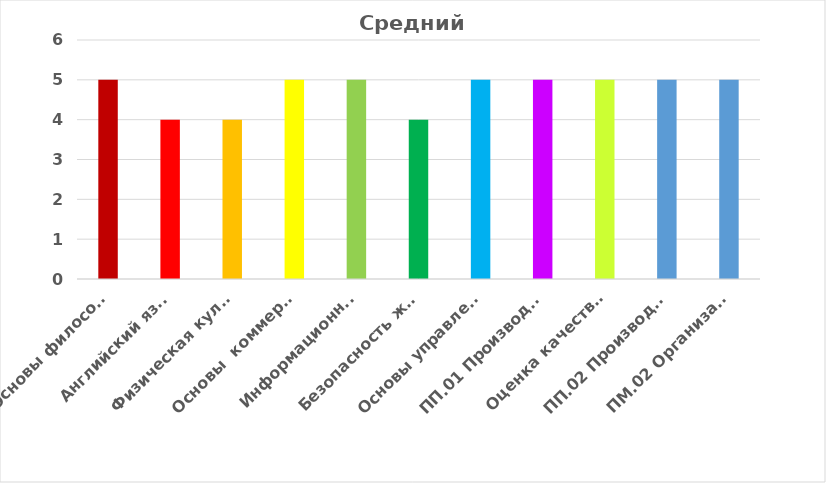
| Category | Средний балл |
|---|---|
| Основы философии  | 5 |
| Английский язык | 4 |
|  Физическая культура | 4 |
| Основы  коммерческой деятельности | 5 |
| Информационные технологии в профессиональной деятельности | 5 |
| Безопасность жизнедеятельности | 4 |
| Основы управления ассортиментом товаров | 5 |
| ПП.01 Производственная практика | 5 |
|  Оценка качества товаров и основы экспертизы | 5 |
| ПП.02 Производственная практика | 5 |
| ПМ.02 Организация и проведение экспертизы и оценка качества товаров | 5 |